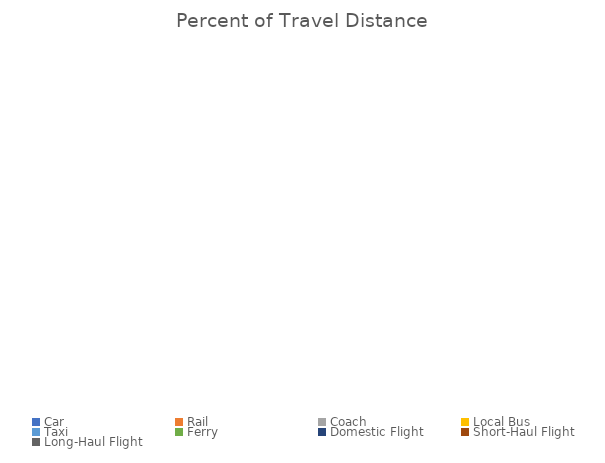
| Category | Percent of Travel Distance |
|---|---|
| Car | 0 |
| Rail | 0 |
| Coach | 0 |
| Local Bus | 0 |
| Taxi | 0 |
| Ferry | 0 |
| Domestic Flight | 0 |
| Short-Haul Flight | 0 |
| Long-Haul Flight | 0 |